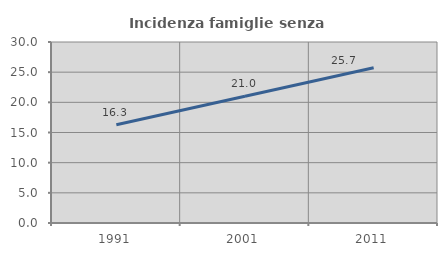
| Category | Incidenza famiglie senza nuclei |
|---|---|
| 1991.0 | 16.285 |
| 2001.0 | 21.013 |
| 2011.0 | 25.734 |